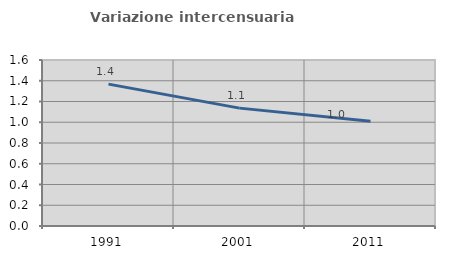
| Category | Variazione intercensuaria annua |
|---|---|
| 1991.0 | 1.368 |
| 2001.0 | 1.136 |
| 2011.0 | 1.01 |